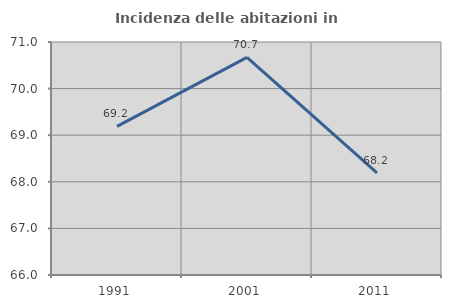
| Category | Incidenza delle abitazioni in proprietà  |
|---|---|
| 1991.0 | 69.19 |
| 2001.0 | 70.668 |
| 2011.0 | 68.194 |